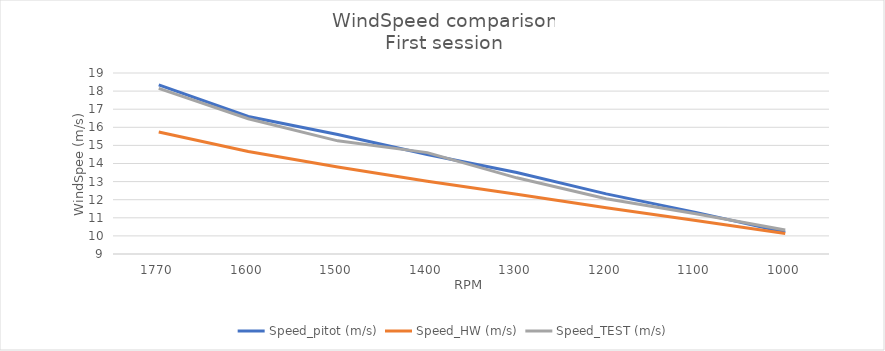
| Category | Speed_pitot (m/s) | Speed_HW (m/s) | Speed_TEST (m/s) |
|---|---|---|---|
| 1770.0 | 18.34 | 15.74 | 18.153 |
| 1600.0 | 16.6 | 14.66 | 16.473 |
| 1500.0 | 15.6 | 13.81 | 15.251 |
| 1400.0 | 14.5 | 13.02 | 14.602 |
| 1300.0 | 13.5 | 12.3 | 13.208 |
| 1200.0 | 12.32 | 11.56 | 12.057 |
| 1100.0 | 11.3 | 10.85 | 11.225 |
| 1000.0 | 10.2 | 10.13 | 10.325 |